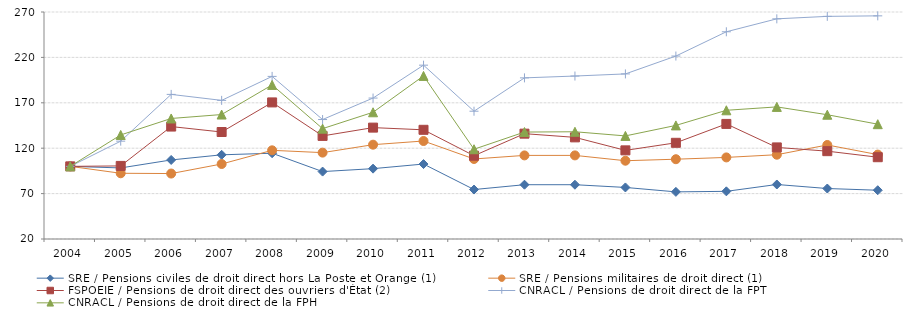
| Category | SRE / Pensions civiles de droit direct hors La Poste et Orange (1) | SRE / Pensions militaires de droit direct (1) | FSPOEIE / Pensions de droit direct des ouvriers d'État (2) | CNRACL / Pensions de droit direct de la FPT | CNRACL / Pensions de droit direct de la FPH |
|---|---|---|---|---|---|
| 2004.0 | 100 | 100 | 100 | 100 | 100 |
| 2005.0 | 98.28 | 92.393 | 100.496 | 127.752 | 134.603 |
| 2006.0 | 107.072 | 92.08 | 143.833 | 179.252 | 152.734 |
| 2007.0 | 112.71 | 102.615 | 137.83 | 172.662 | 157.071 |
| 2008.0 | 114.462 | 117.658 | 170.43 | 199.075 | 189.712 |
| 2009.0 | 94.251 | 115.119 | 133.535 | 151.573 | 141.544 |
| 2010.0 | 97.486 | 123.882 | 142.676 | 175.23 | 159.573 |
| 2011.0 | 102.557 | 127.918 | 140.253 | 211.445 | 199.606 |
| 2012.0 | 74.478 | 108.138 | 111.729 | 160.742 | 118.873 |
| 2013.0 | 79.791 | 112.069 | 136.013 | 197.457 | 137.779 |
| 2014.0 | 79.791 | 112.078 | 131.938 | 199.465 | 138.102 |
| 2015.0 | 76.784 | 106.208 | 117.621 | 201.807 | 133.524 |
| 2016.0 | 71.908 | 107.872 | 125.936 | 221.485 | 145.094 |
| 2017.0 | 72.493 | 109.848 | 146.751 | 248.226 | 161.745 |
| 2018.0 | 80.031 | 112.825 | 120.87 | 262.476 | 165.485 |
| 2019.0 | 75.594 | 123.544 | 116.74 | 265.184 | 156.868 |
| 2020.0 | 73.71 | 112.958 | 110.077 | 265.756 | 146.453 |